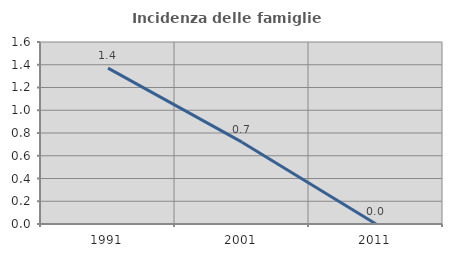
| Category | Incidenza delle famiglie numerose |
|---|---|
| 1991.0 | 1.37 |
| 2001.0 | 0.719 |
| 2011.0 | 0 |